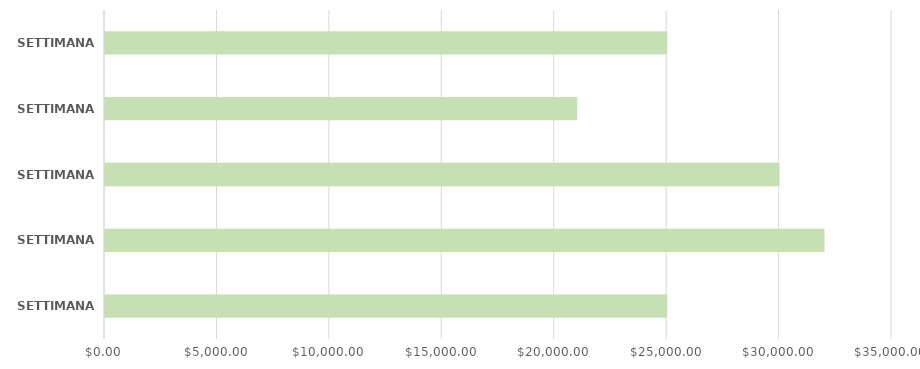
| Category | Series 0 |
|---|---|
| SETTIMANA 1 | 25000 |
| SETTIMANA 2 | 32000 |
| SETTIMANA 3 | 30000 |
| SETTIMANA 4 | 21000 |
| SETTIMANA 5 | 25000 |